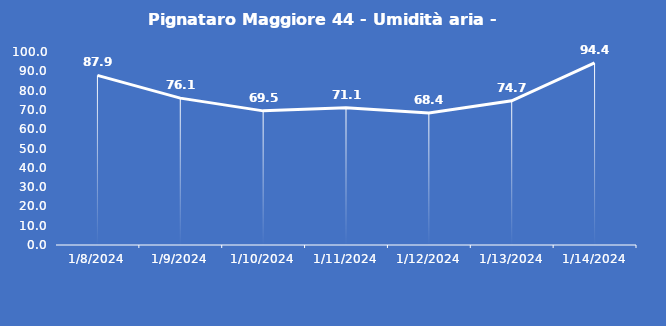
| Category | Pignataro Maggiore 44 - Umidità aria - Grezzo (%) |
|---|---|
| 1/8/24 | 87.9 |
| 1/9/24 | 76.1 |
| 1/10/24 | 69.5 |
| 1/11/24 | 71.1 |
| 1/12/24 | 68.4 |
| 1/13/24 | 74.7 |
| 1/14/24 | 94.4 |